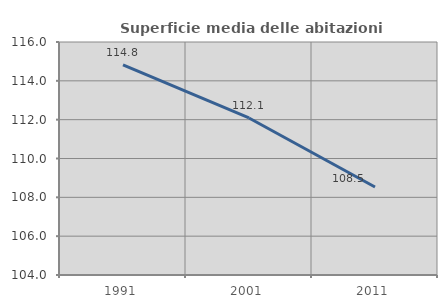
| Category | Superficie media delle abitazioni occupate |
|---|---|
| 1991.0 | 114.822 |
| 2001.0 | 112.089 |
| 2011.0 | 108.534 |